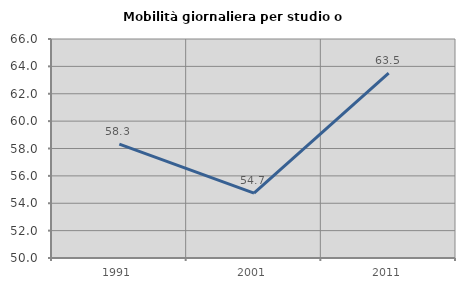
| Category | Mobilità giornaliera per studio o lavoro |
|---|---|
| 1991.0 | 58.322 |
| 2001.0 | 54.74 |
| 2011.0 | 63.507 |